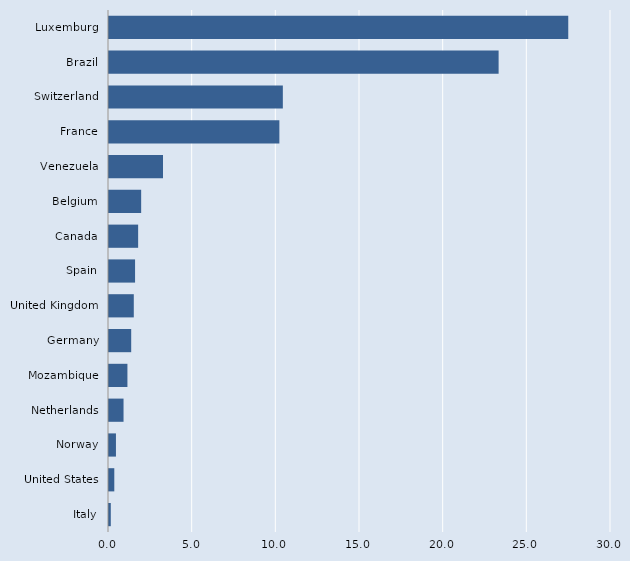
| Category | Series 0 |
|---|---|
| Italy | 0.107 |
| United States | 0.317 |
| Norway | 0.415 |
| Netherlands | 0.869 |
| Mozambique | 1.101 |
| Germany | 1.326 |
| United Kingdom | 1.482 |
| Spain | 1.558 |
| Canada | 1.742 |
| Belgium | 1.922 |
| Venezuela | 3.227 |
| France | 10.182 |
| Switzerland | 10.389 |
| Brazil | 23.284 |
| Luxemburg | 27.446 |